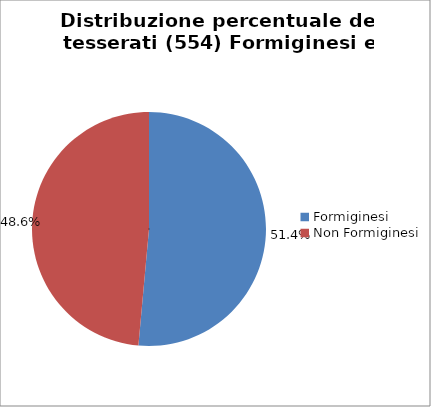
| Category | Nr. Tesserati |
|---|---|
| Formiginesi | 285 |
| Non Formiginesi | 269 |